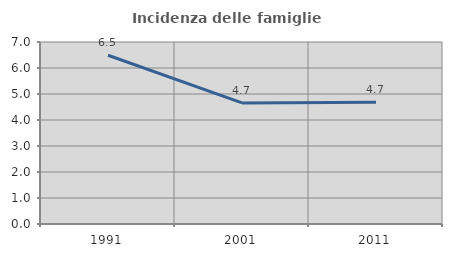
| Category | Incidenza delle famiglie numerose |
|---|---|
| 1991.0 | 6.49 |
| 2001.0 | 4.658 |
| 2011.0 | 4.681 |